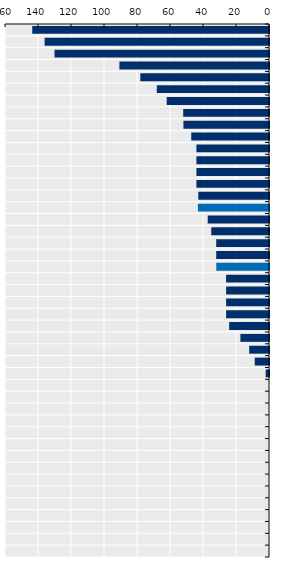
| Category | Length in weeks |
|---|---|
| Finland | 143.5 |
| Hungary | 136 |
| Slovak Republic | 130 |
| Romania | 90.667 |
| Latvia | 78 |
| Norway | 68 |
| Estonia | 62 |
| Korea | 52 |
| Bulgaria | 51.86 |
| Czech Republic | 47.117 |
| Lithuania | 44 |
| Austria | 44 |
| Germany | 44 |
| Japan | 44 |
| Sweden | 42.857 |
| EU average | 43.06 |
| Slovenia | 37.143 |
| Canada | 35 |
| Poland | 32 |
| Denmark | 32 |
| OECD average | 31.941 |
| Luxembourg | 26 |
| Croatia | 26 |
| Italy | 26 |
| France | 26 |
| Portugal | 24.14 |
| Belgium | 17.333 |
| Chile | 12 |
| Iceland | 8.67 |
| Ireland | 2 |
| Greece | 0 |
| United Kingdom | 0 |
| Australia | 0 |
| New Zealand | 0 |
| Cyprus | 0 |
| Malta | 0 |
| Costa Rica | 0 |
| Netherlands | 0 |
| Spain | 0 |
| Turkey | 0 |
| Israel | 0 |
| Switzerland | 0 |
| Mexico | 0 |
| United States | 0 |
| Colombia | 0 |